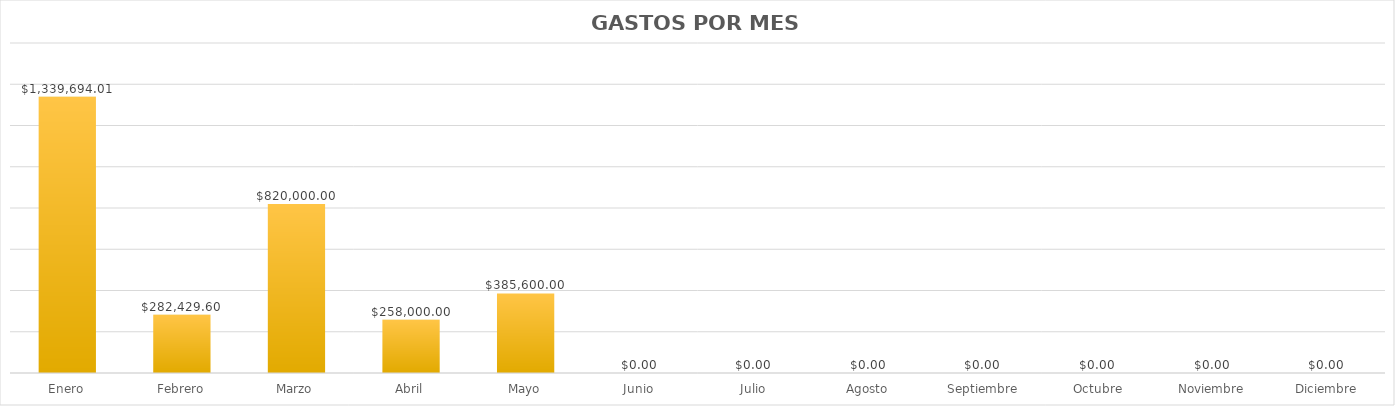
| Category | Series 0 |
|---|---|
| Enero | 1339694.01 |
| Febrero | 282429.6 |
| Marzo | 820000 |
| Abril | 258000 |
| Mayo | 385600 |
| Junio | 0 |
| Julio | 0 |
| Agosto | 0 |
| Septiembre | 0 |
| Octubre | 0 |
| Noviembre | 0 |
| Diciembre | 0 |